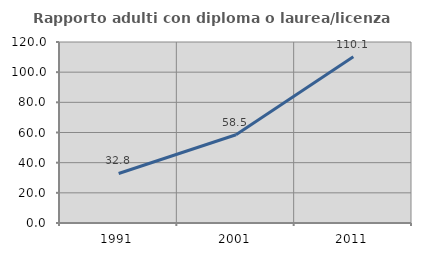
| Category | Rapporto adulti con diploma o laurea/licenza media  |
|---|---|
| 1991.0 | 32.836 |
| 2001.0 | 58.537 |
| 2011.0 | 110.145 |